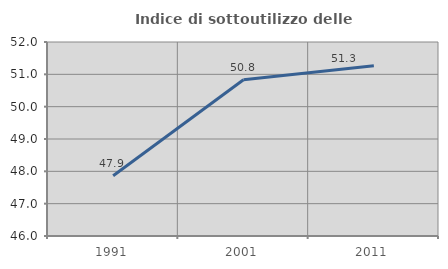
| Category | Indice di sottoutilizzo delle abitazioni  |
|---|---|
| 1991.0 | 47.865 |
| 2001.0 | 50.831 |
| 2011.0 | 51.267 |